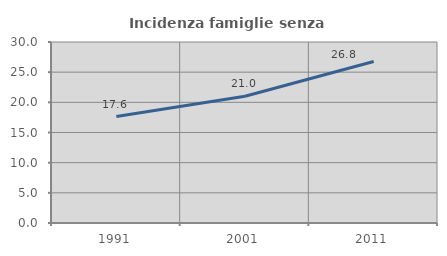
| Category | Incidenza famiglie senza nuclei |
|---|---|
| 1991.0 | 17.639 |
| 2001.0 | 21.02 |
| 2011.0 | 26.771 |